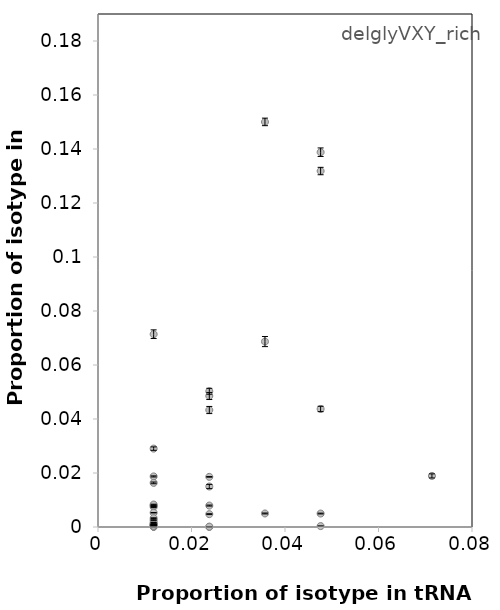
| Category | SBW25 |
|---|---|
| 0.023809523809523808 | 0.049 |
| 0.03571428571428571 | 0.069 |
| 0.047619047619047616 | 0.005 |
| 0.011904761904761904 | 0.001 |
| 0.011904761904761904 | 0.001 |
| 0.011904761904761904 | 0.003 |
| 0.047619047619047616 | 0.139 |
| 0.03571428571428571 | 0.15 |
| 0.011904761904761904 | 0.007 |
| 0.047619047619047616 | 0 |
| 0.023809523809523808 | 0.05 |
| 0.023809523809523808 | 0.043 |
| 0.047619047619047616 | 0.132 |
| 0.011904761904761904 | 0.008 |
| 0.011904761904761904 | 0.071 |
| 0.011904761904761904 | 0.019 |
| 0.011904761904761904 | 0 |
| 0.023809523809523808 | 0 |
| 0.03571428571428571 | 0.005 |
| 0.011904761904761904 | 0 |
| 0.047619047619047616 | 0.044 |
| 0.011904761904761904 | 0.002 |
| 0.011904761904761904 | 0 |
| 0.011904761904761904 | 0.008 |
| 0.07142857142857142 | 0.019 |
| 0.023809523809523808 | 0.008 |
| 0.023809523809523808 | 0 |
| 0.011904761904761904 | 0.001 |
| 0.011904761904761904 | 0.005 |
| 0.011904761904761904 | 0.003 |
| 0.011904761904761904 | 0 |
| 0.011904761904761904 | 0 |
| 0.011904761904761904 | 0.029 |
| 0.023809523809523808 | 0.019 |
| 0.011904761904761904 | 0.001 |
| 0.023809523809523808 | 0.005 |
| 0.023809523809523808 | 0.015 |
| 0.011904761904761904 | 0.016 |
| 0.011904761904761904 | 0 |